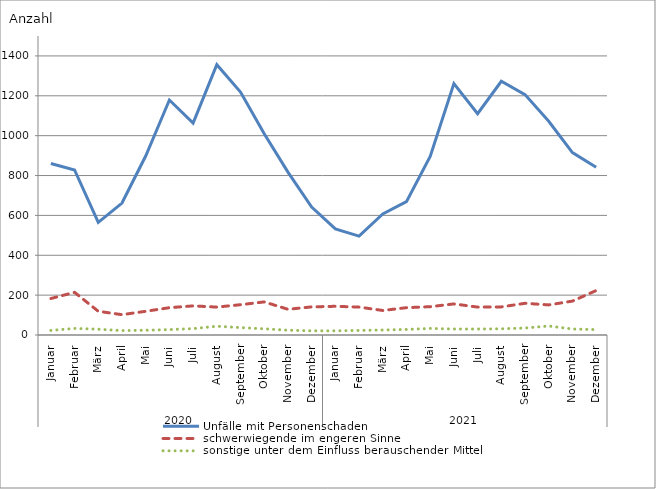
| Category | Unfälle mit Personenschaden | schwerwiegende im engeren Sinne | sonstige unter dem Einfluss berauschender Mittel |
|---|---|---|---|
| 0 | 860 | 183 | 23 |
| 1 | 828 | 214 | 33 |
| 2 | 565 | 119 | 29 |
| 3 | 662 | 102 | 22 |
| 4 | 898 | 119 | 24 |
| 5 | 1179 | 137 | 27 |
| 6 | 1063 | 146 | 32 |
| 7 | 1356 | 140 | 44 |
| 8 | 1219 | 152 | 37 |
| 9 | 1010 | 166 | 31 |
| 10 | 817 | 129 | 24 |
| 11 | 642 | 141 | 21 |
| 12 | 532 | 144 | 21 |
| 13 | 496 | 140 | 23 |
| 14 | 607 | 123 | 25 |
| 15 | 669 | 137 | 28 |
| 16 | 896 | 142 | 33 |
| 17 | 1261 | 156 | 30 |
| 18 | 1110 | 140 | 30 |
| 19 | 1273 | 141 | 31 |
| 20 | 1206 | 159 | 35 |
| 21 | 1072 | 151 | 45 |
| 22 | 915 | 170 | 30 |
| 23 | 842 | 223 | 27 |